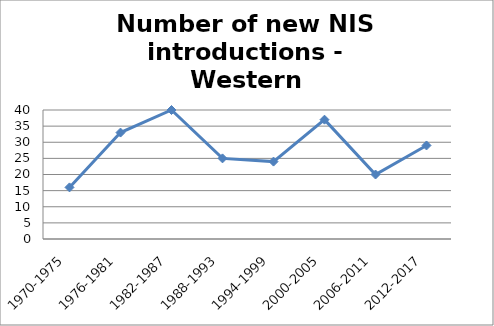
| Category | Number of new NIS introductions - Western Mediterranean |
|---|---|
| 1970-1975 | 16 |
| 1976-1981 | 33 |
| 1982-1987 | 40 |
| 1988-1993 | 25 |
| 1994-1999 | 24 |
| 2000-2005 | 37 |
| 2006-2011 | 20 |
| 2012-2017 | 29 |